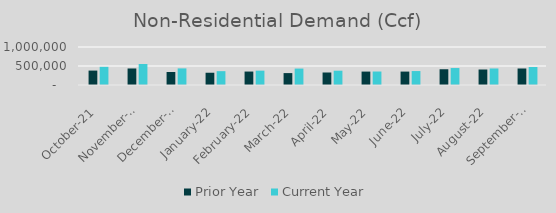
| Category | Prior Year | Current Year |
|---|---|---|
| 2021-10-01 | 379515 | 477878.526 |
| 2021-11-01 | 434815 | 552599.698 |
| 2021-12-01 | 342584.594 | 436956.784 |
| 2022-01-01 | 322657.16 | 364164.019 |
| 2022-02-01 | 354041 | 377149.369 |
| 2022-03-01 | 313343 | 432270.798 |
| 2022-04-01 | 329084.722 | 376255.784 |
| 2022-05-01 | 353085 | 354792 |
| 2022-06-01 | 353141.442 | 367009.666 |
| 2022-07-01 | 414577.112 | 446288 |
| 2022-08-01 | 407774.995 | 434730.757 |
| 2022-09-01 | 434192.442 | 474194 |